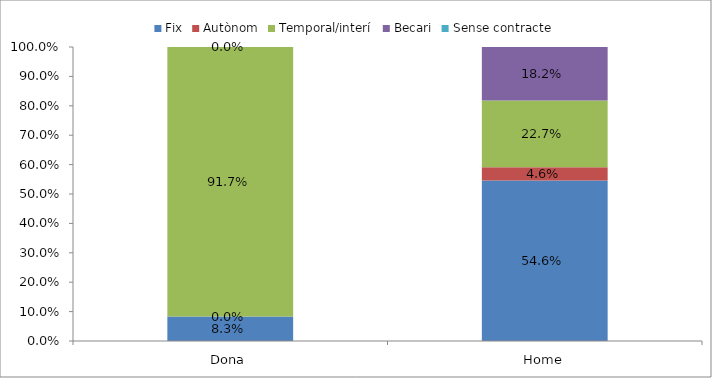
| Category | Fix | Autònom | Temporal/interí | Becari | Sense contracte |
|---|---|---|---|---|---|
| Dona | 0.083 | 0 | 0.917 | 0 | 0 |
| Home | 0.546 | 0.046 | 0.227 | 0.182 | 0 |